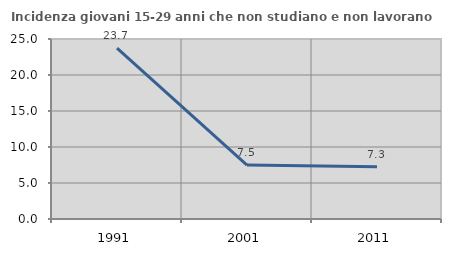
| Category | Incidenza giovani 15-29 anni che non studiano e non lavorano  |
|---|---|
| 1991.0 | 23.741 |
| 2001.0 | 7.488 |
| 2011.0 | 7.269 |